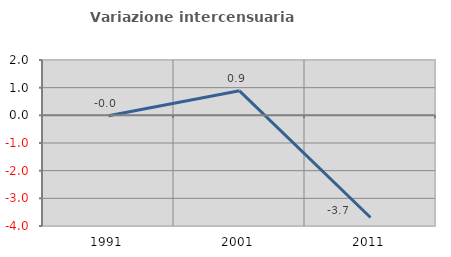
| Category | Variazione intercensuaria annua |
|---|---|
| 1991.0 | -0.015 |
| 2001.0 | 0.885 |
| 2011.0 | -3.691 |